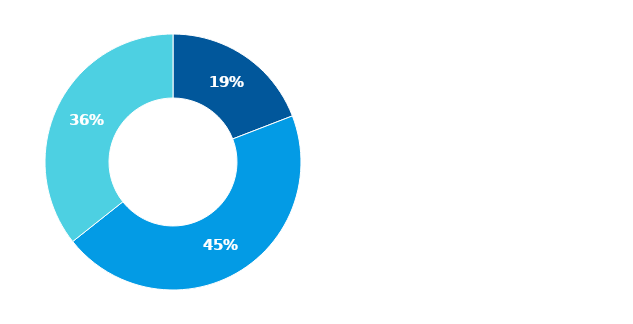
| Category | Series 0 |
|---|---|
| Hotovost | 0.191 |
| Půjčky poskytnuté nemovitostní společnosti | 0.452 |
| Majetkové účasti v nemovitostní společnosti | 0.357 |
| Ostatní finanční aktiva | 0 |